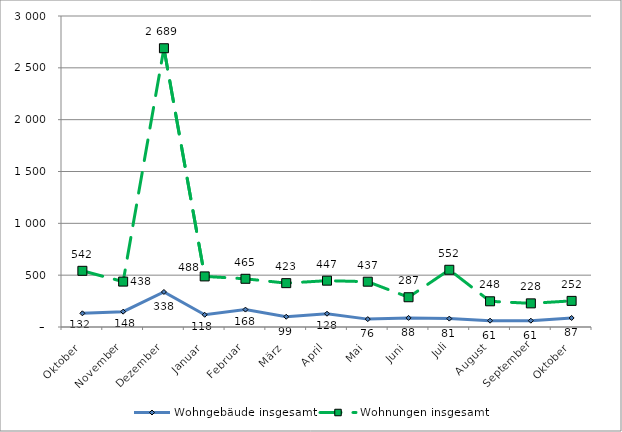
| Category | Wohngebäude insgesamt | Wohnungen insgesamt |
|---|---|---|
| Oktober | 132 | 542 |
| November | 148 | 438 |
| Dezember | 338 | 2689 |
| Januar | 118 | 488 |
| Februar | 168 | 465 |
| März | 99 | 423 |
| April | 128 | 447 |
| Mai | 76 | 437 |
| Juni | 88 | 287 |
| Juli | 81 | 552 |
| August | 61 | 248 |
| September | 61 | 228 |
| Oktober | 87 | 252 |